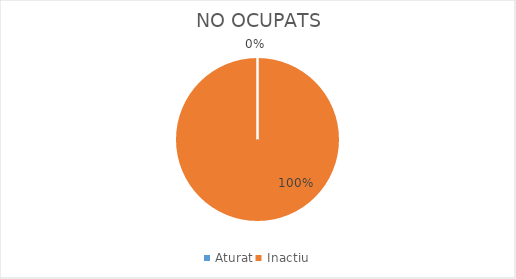
| Category | Series 0 |
|---|---|
| Aturat | 0 |
| Inactiu | 1 |